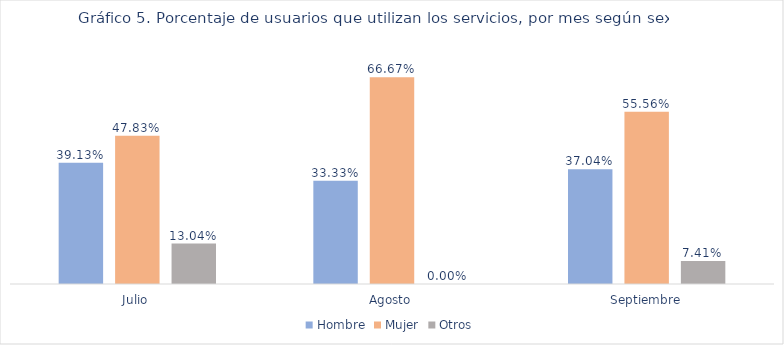
| Category | Hombre | Mujer | Otros |
|---|---|---|---|
| Julio | 0.391 | 0.478 | 0.13 |
| Agosto | 0.333 | 0.667 | 0 |
| Septiembre | 0.37 | 0.556 | 0.074 |